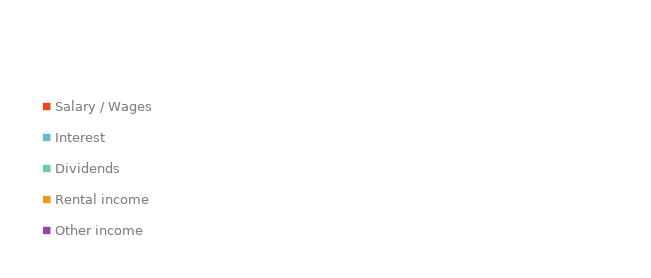
| Category | Series 0 |
|---|---|
| Salary / Wages | 0 |
| Interest | 0 |
| Dividends | 0 |
| Rental income | 0 |
| Other income | 0 |